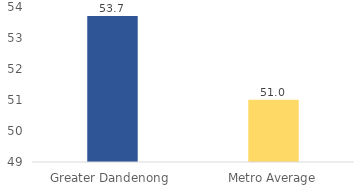
| Category | Series 0 |
|---|---|
| Greater Dandenong | 53.71 |
| Metro Average | 51.01 |